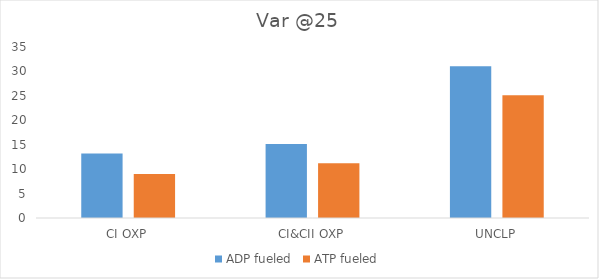
| Category | ADP fueled | ATP fueled |
|---|---|---|
| CI OXP | 13.206 | 8.992 |
| CI&CII OXP | 15.121 | 11.192 |
| UNCLP | 31.038 | 25.122 |